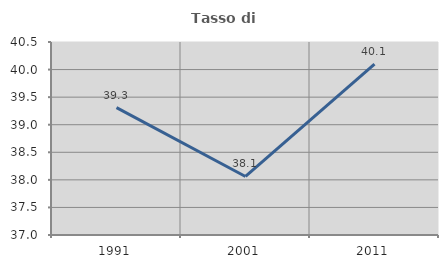
| Category | Tasso di occupazione   |
|---|---|
| 1991.0 | 39.309 |
| 2001.0 | 38.061 |
| 2011.0 | 40.1 |